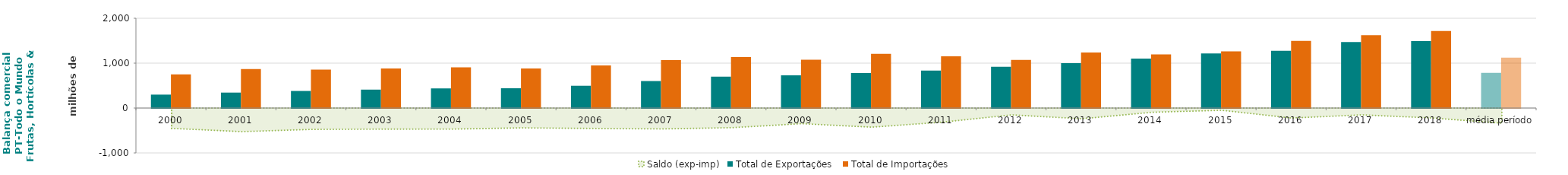
| Category | Total de Exportações  | Total de Importações  |
|---|---|---|
| 2000 | 298.97 | 751.669 |
| 2001 | 344.273 | 870.081 |
| 2002 | 380.48 | 856.16 |
| 2003 | 410.523 | 880.226 |
| 2004 | 437.374 | 906.434 |
| 2005 | 440.977 | 882.633 |
| 2006 | 496.484 | 950.801 |
| 2007 | 601.746 | 1066.43 |
| 2008 | 699.012 | 1136.896 |
| 2009 | 729.671 | 1077.488 |
| 2010 | 780.307 | 1206.18 |
| 2011 | 836.622 | 1152.087 |
| 2012 | 920.934 | 1073.394 |
| 2013 | 999.936 | 1238.777 |
| 2014 | 1101.402 | 1196.038 |
| 2015 | 1213.991 | 1263.516 |
| 2016 | 1273.506 | 1496.085 |
| 2017 | 1469.71 | 1621.929 |
| 2018 | 1493.508 | 1714.664 |
| média período | 785.759 | 1123.236 |